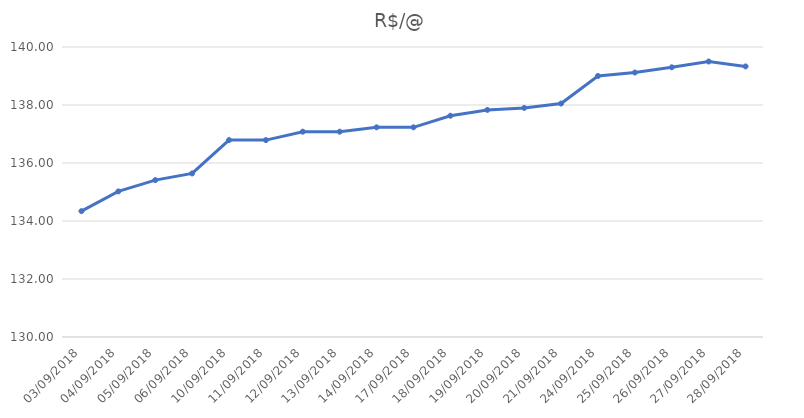
| Category | R$/@ |
|---|---|
| 03/09/2018 | 134.34 |
| 04/09/2018 | 135.02 |
| 05/09/2018 | 135.41 |
| 06/09/2018 | 135.64 |
| 10/09/2018 | 136.79 |
| 11/09/2018 | 136.79 |
| 12/09/2018 | 137.08 |
| 13/09/2018 | 137.08 |
| 14/09/2018 | 137.23 |
| 17/09/2018 | 137.23 |
| 18/09/2018 | 137.63 |
| 19/09/2018 | 137.83 |
| 20/09/2018 | 137.9 |
| 21/09/2018 | 138.05 |
| 24/09/2018 | 139 |
| 25/09/2018 | 139.12 |
| 26/09/2018 | 139.3 |
| 27/09/2018 | 139.5 |
| 28/09/2018 | 139.33 |